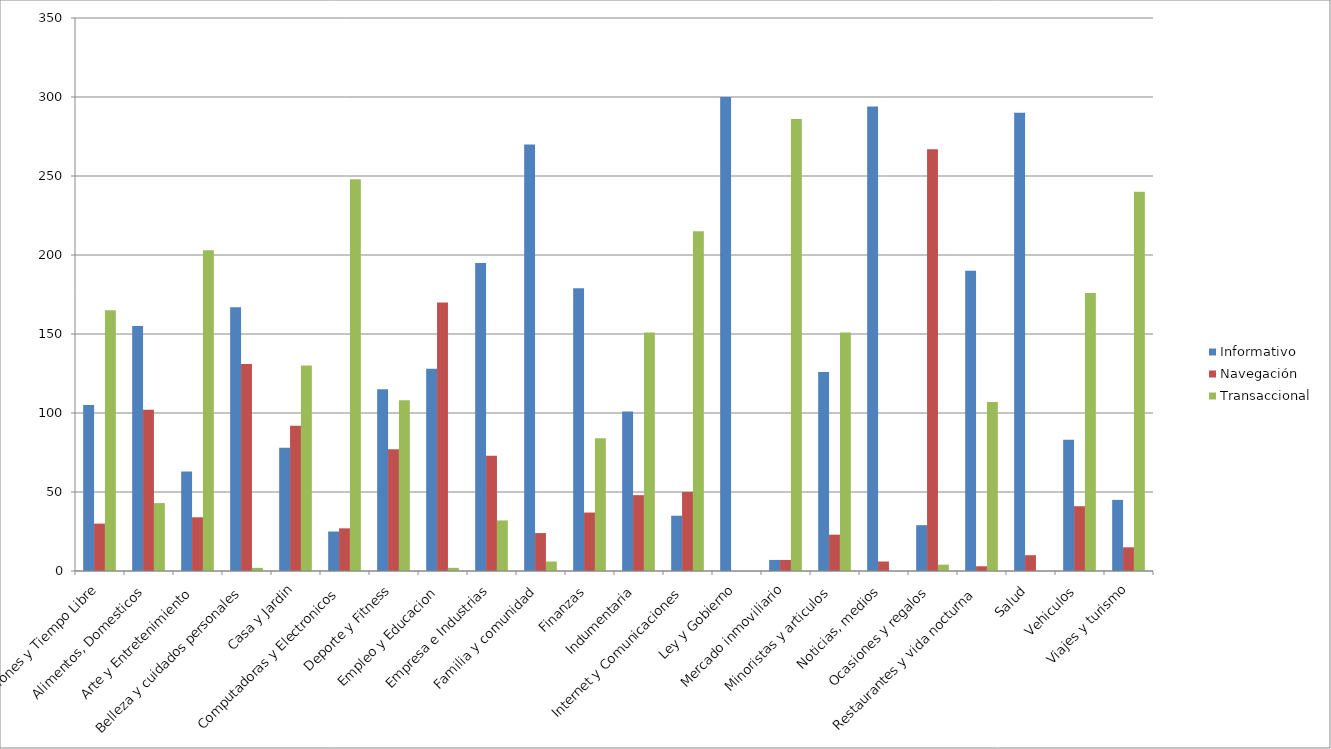
| Category | Informativo | Navegación | Transaccional |
|---|---|---|---|
| Aficiones y Tiempo Libre | 105 | 30 | 165 |
| Alimentos, Domesticos | 155 | 102 | 43 |
| Arte y Entretenimiento | 63 | 34 | 203 |
| Belleza y cuidados personales | 167 | 131 | 2 |
| Casa y Jardin | 78 | 92 | 130 |
| Computadoras y Electronicos | 25 | 27 | 248 |
| Deporte y Fitness | 115 | 77 | 108 |
| Empleo y Educacion | 128 | 170 | 2 |
| Empresa e Industrias | 195 | 73 | 32 |
| Familia y comunidad | 270 | 24 | 6 |
| Finanzas | 179 | 37 | 84 |
| Indumentaria | 101 | 48 | 151 |
| Internet y Comunicaciones | 35 | 50 | 215 |
| Ley y Gobierno | 300 | 0 | 0 |
| Mercado inmoviliario | 7 | 7 | 286 |
| Minoristas y articulos | 126 | 23 | 151 |
| Noticias, medios | 294 | 6 | 0 |
| Ocasiones y regalos | 29 | 267 | 4 |
| Restaurantes y vida nocturna | 190 | 3 | 107 |
| Salud | 290 | 10 | 0 |
| Vehiculos | 83 | 41 | 176 |
| Viajes y turismo | 45 | 15 | 240 |